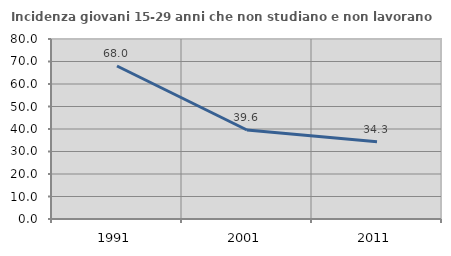
| Category | Incidenza giovani 15-29 anni che non studiano e non lavorano  |
|---|---|
| 1991.0 | 68.003 |
| 2001.0 | 39.56 |
| 2011.0 | 34.328 |